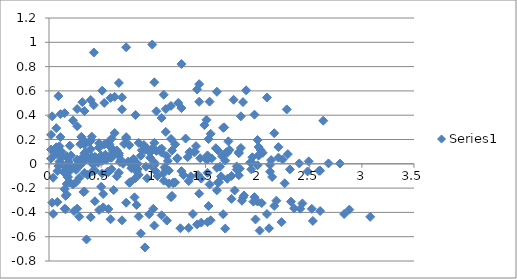
| Category | Series 0 |
|---|---|
| 1.9399999999999995 | -0.046 |
| 0.23000000000000043 | -0.169 |
| 0.1999999999999993 | -0.154 |
| 0.9700000000000006 | 0.05 |
| 0.370000000000001 | -0.092 |
| 0.17999999999999972 | -0.111 |
| 0.8499999999999996 | -0.044 |
| 1.9800000000000004 | -0.458 |
| 0.7099999999999991 | 0 |
| 1.3100000000000005 | 0.208 |
| 0.14000000000000057 | -0.067 |
| 0.8100000000000005 | 0.018 |
| 1.1500000000000004 | -0.056 |
| 0.5399999999999991 | 0.053 |
| 1.83 | -0.041 |
| 0.6500000000000004 | -0.103 |
| 0.20999999999999908 | 0.069 |
| 0.11999999999999922 | 0.05 |
| 1.75 | -0.1 |
| 1.67 | -0.415 |
| 1.3499999999999996 | 0.093 |
| 0.02999999999999936 | -0.32 |
| 1.6400000000000006 | -0.024 |
| 0.3000000000000007 | -0.01 |
| 2.2300000000000004 | -0.48 |
| 1.2400000000000002 | 0.501 |
| 1.709999999999999 | -0.124 |
| 2.139999999999999 | -0.109 |
| 0.9699999999999989 | 0.096 |
| 2.3100000000000005 | -0.046 |
| 2.119999999999999 | -0.065 |
| 2.789999999999999 | 0.002 |
| 0.040000000000000924 | -0.412 |
| 1.2300000000000004 | 0.046 |
| 0.629999999999999 | 0.254 |
| 1.799999999999999 | -0.022 |
| 1.129999999999999 | 0.064 |
| 0.7899999999999991 | -0.01 |
| 1.4000000000000004 | 0.098 |
| 0.10999999999999943 | 0.005 |
| 2.59 | -0.058 |
| 1.7300000000000004 | 0.115 |
| 1.8200000000000003 | 0.096 |
| 0.1899999999999995 | -0.055 |
| 0.2699999999999996 | -0.369 |
| 0.5899999999999999 | 0.139 |
| 1.9699999999999989 | -0.274 |
| 0.29999999999999893 | 0.022 |
| 2.24 | 0.035 |
| 0.2900000000000009 | -0.435 |
| 0.6999999999999993 | 0.547 |
| 0.4299999999999997 | 0.015 |
| 0.7400000000000002 | 0.22 |
| 0.6000000000000014 | 0.078 |
| 0.41000000000000014 | 0.058 |
| 1.08 | 0.125 |
| 1.75 | -0.289 |
| 0.47999999999999865 | 0.17 |
| 1.08 | 0.377 |
| 0.08999999999999986 | 0.102 |
| 0.5800000000000001 | 0.188 |
| 0.9199999999999999 | 0.113 |
| 0.3099999999999987 | 0.222 |
| 1.5999999999999996 | 0.128 |
| 0.8800000000000008 | 0.066 |
| 0.02000000000000135 | 0.238 |
| 0.11000000000000121 | 0.219 |
| 1.5199999999999996 | 0.069 |
| 1.4399999999999995 | -0.245 |
| 1.1199999999999992 | 0.262 |
| 0.2599999999999998 | -0.151 |
| 1.4100000000000001 | 0.145 |
| 0.5300000000000011 | 0.159 |
| 2.0 | -0.311 |
| 1.0099999999999998 | 0.671 |
| 1.17 | 0.204 |
| 0.1700000000000017 | 0.063 |
| 0.019999999999999574 | 0.043 |
| 0.6500000000000004 | 0.11 |
| 2.1799999999999997 | -0.304 |
| 0.9099999999999984 | 0.155 |
| 1.5099999999999998 | 0.362 |
| 0.33999999999999986 | 0.087 |
| 1.0099999999999998 | 0.173 |
| 1.3499999999999996 | 0.098 |
| 0.7399999999999984 | 0.207 |
| 2.0299999999999994 | 0.113 |
| 0.45000000000000107 | 0.051 |
| 0.40999999999999837 | 0.223 |
| 0.3199999999999985 | 0.204 |
| 1.9499999999999993 | 0.054 |
| 1.8699999999999992 | -0.26 |
| 1.549999999999999 | 0.247 |
| 0.16999999999999993 | -0.166 |
| 1.8399999999999999 | 0.13 |
| 0.10000000000000142 | 0.144 |
| 2.4299999999999997 | -0.326 |
| 1.4399999999999995 | 0.655 |
| 1.3400000000000016 | -0.142 |
| 1.1500000000000004 | -0.161 |
| 1.8200000000000003 | -0.094 |
| 1.0099999999999998 | -0.508 |
| 0.26000000000000156 | -0.05 |
| 0.33999999999999986 | 0.158 |
| 0.8300000000000001 | -0.117 |
| 0.16000000000000014 | -0.032 |
| 0.17999999999999972 | -0.106 |
| 0.4300000000000015 | 0.002 |
| 0.8599999999999994 | -0.091 |
| 1.620000000000001 | -0.154 |
| 0.7600000000000016 | 0.019 |
| 0.8500000000000014 | 0 |
| 0.7799999999999994 | -0.151 |
| 0.6999999999999993 | -0.465 |
| 0.379999999999999 | 0.043 |
| 1.0 | -0.37 |
| 0.6699999999999999 | -0.074 |
| 1.2700000000000014 | -0.061 |
| 1.2599999999999998 | -0.531 |
| 0.2699999999999996 | 0.451 |
| 0.19000000000000128 | -0.019 |
| 0.47999999999999865 | 0.048 |
| 2.3500000000000014 | -0.366 |
| 1.08 | 0.092 |
| 1.6800000000000015 | 0.3 |
| 0.5100000000000016 | 0.024 |
| 1.1800000000000015 | 0.11 |
| 1.5200000000000014 | 0.036 |
| 0.9100000000000001 | 0.144 |
| 2.200000000000001 | 0.051 |
| 0.27999999999999936 | -0.012 |
| 0.5800000000000001 | 0.161 |
| 0.4900000000000002 | 0.142 |
| 2.120000000000001 | -0.009 |
| 2.040000000000001 | -0.323 |
| 1.7200000000000006 | 0.185 |
| 0.34000000000000163 | -0.228 |
| 2.0100000000000016 | 0.068 |
| 0.07000000000000028 | 0.081 |
| 2.6000000000000014 | -0.389 |
| 1.6100000000000012 | 0.593 |
| 0.6699999999999999 | 0.067 |
| 2.16 | -0.347 |
| 0.8899999999999988 | 0.111 |
| 1.4900000000000002 | 0.319 |
| 0.3200000000000003 | 0.044 |
| 0.9900000000000002 | 0.129 |
| 1.33 | 0.055 |
| 0.7199999999999989 | 0.164 |
| 2.01 | 0.07 |
| 0.47000000000000064 | 0.008 |
| 0.3899999999999988 | 0.18 |
| 0.29999999999999893 | 0.161 |
| 1.9299999999999997 | 0.011 |
| 1.8499999999999996 | -0.304 |
| 1.5299999999999994 | 0.204 |
| 0.15000000000000036 | -0.209 |
| 1.8200000000000003 | 0.087 |
| 0.120000000000001 | 0.101 |
| 2.41 | -0.37 |
| 1.42 | 0.612 |
| 2.83 | -0.414 |
| 1.5599999999999987 | 0.044 |
| 2.16 | 0.252 |
| 0.9900000000000002 | -0.023 |
| 1.6600000000000001 | 0.062 |
| 2.0 | -0.012 |
| 1.3899999999999988 | 0.097 |
| 2.6799999999999997 | 0.003 |
| 0.1999999999999993 | -0.059 |
| 1.0599999999999987 | 0.113 |
| 0.9699999999999989 | 0.094 |
| 2.5999999999999996 | -0.056 |
| 2.5199999999999996 | -0.371 |
| 2.1999999999999993 | 0.137 |
| 0.8200000000000003 | -0.276 |
| 2.49 | 0.02 |
| 0.5499999999999989 | 0.034 |
| 3.08 | -0.436 |
| 2.09 | 0.545 |
| 1.2700000000000014 | 0.458 |
| 0.6699999999999999 | 0.666 |
| 1.8399999999999999 | 0.391 |
| 1.17 | 0.476 |
| 0.8300000000000001 | 0.402 |
| 1.4400000000000013 | 0.511 |
| 0.15000000000000036 | 0.417 |
| 2.630000000000001 | 0.355 |
| 1.7700000000000014 | 0.527 |
| 1.8600000000000012 | 0.508 |
| 0.23000000000000043 | 0.357 |
| 0.3100000000000005 | 0.043 |
| 0.6300000000000008 | 0.551 |
| 2.01 | 0.138 |
| 0.33999999999999986 | 0.434 |
| 2.280000000000001 | 0.448 |
| 0.25 | -0.023 |
| 0.7400000000000002 | 0.959 |
| 0.6000000000000014 | 0.208 |
| 0.5699999999999985 | -0.068 |
| 0.10000000000000142 | 0.018 |
| 0.4400000000000013 | -0.056 |
| 0.16999999999999993 | 0.052 |
| 1.120000000000001 | -0.041 |
| 1.3599999999999994 | -0.104 |
| 0.5 | 0.069 |
| 0.5899999999999999 | 0.05 |
| 1.040000000000001 | -0.101 |
| 0.9600000000000009 | -0.415 |
| 0.6400000000000006 | 0.093 |
| 0.7399999999999984 | -0.32 |
| 0.9300000000000015 | -0.024 |
| 1.0099999999999998 | -0.011 |
| 1.5200000000000014 | -0.481 |
| 0.5300000000000011 | 0.501 |
| 1.17 | -0.275 |
| 0.5 | -0.189 |
| 0.16000000000000014 | -0.264 |
| 0.7700000000000014 | -0.155 |
| 0.5199999999999996 | -0.249 |
| 1.9600000000000009 | -0.311 |
| 1.1000000000000014 | -0.139 |
| 1.1900000000000013 | -0.158 |
| 0.4399999999999995 | -0.308 |
| 0.35999999999999943 | -0.623 |
| 0.03999999999999915 | -0.115 |
| 1.3399999999999999 | -0.528 |
| 0.33000000000000007 | -0.232 |
| 1.6100000000000012 | -0.218 |
| 0.9199999999999999 | -0.688 |
| 0.07000000000000028 | 0.293 |
| 0.6699999999999999 | 0.086 |
| 1.0099999999999998 | 0.011 |
| 0.3999999999999986 | 0.12 |
| 1.6899999999999995 | 0.026 |
| 0.7900000000000009 | -0.036 |
| 0.06999999999999851 | 0.136 |
| 0.02000000000000135 | 0.117 |
| 1.6099999999999994 | -0.033 |
| 1.5299999999999994 | -0.347 |
| 1.209999999999999 | 0.16 |
| 0.16999999999999993 | -0.253 |
| 1.5 | 0.043 |
| 0.4400000000000013 | 0.057 |
| 2.09 | -0.413 |
| 1.0999999999999996 | 0.569 |
| 0.33999999999999986 | -0.074 |
| 0.27000000000000135 | 0.034 |
| 1.0199999999999996 | -0.059 |
| 1.4600000000000009 | -0.122 |
| 0.6000000000000014 | 0.051 |
| 0.6900000000000013 | 0.032 |
| 0.9399999999999995 | -0.119 |
| 0.8599999999999994 | -0.433 |
| 0.5399999999999991 | 0.075 |
| 0.8399999999999999 | -0.338 |
| 0.8300000000000001 | -0.042 |
| 1.1100000000000012 | -0.029 |
| 1.42 | -0.499 |
| 0.4299999999999997 | 0.483 |
| 0.6100000000000012 | 0.109 |
| 0.6799999999999997 | 0.015 |
| 1.8000000000000007 | -0.047 |
| 0.9400000000000013 | 0.125 |
| 1.0300000000000011 | 0.106 |
| 0.5999999999999996 | -0.044 |
| 0.5199999999999996 | -0.359 |
| 0.1999999999999993 | 0.149 |
| 1.1799999999999997 | -0.264 |
| 0.4900000000000002 | 0.032 |
| 1.450000000000001 | 0.046 |
| 1.08 | -0.424 |
| 0.08999999999999986 | 0.557 |
| 1.290000000000001 | -0.094 |
| 1.1899999999999995 | -0.156 |
| 0.33000000000000007 | 0.017 |
| 0.41999999999999993 | -0.003 |
| 1.2100000000000009 | -0.153 |
| 1.1300000000000008 | -0.467 |
| 0.8100000000000005 | 0.04 |
| 0.5699999999999985 | -0.373 |
| 1.1000000000000014 | -0.077 |
| 0.8399999999999999 | -0.063 |
| 1.6900000000000013 | -0.533 |
| 0.7000000000000011 | 0.449 |
| 2.4800000000000004 | -0.062 |
| 1.620000000000001 | 0.11 |
| 1.7100000000000009 | 0.091 |
| 0.08000000000000007 | -0.06 |
| 0.16000000000000014 | -0.374 |
| 0.4800000000000004 | 0.134 |
| 1.8599999999999994 | -0.279 |
| 0.1899999999999995 | 0.017 |
| 2.130000000000001 | 0.031 |
| 0.40000000000000036 | -0.44 |
| 0.5899999999999999 | 0.542 |
| 0.8599999999999994 | 0.173 |
| 0.7699999999999996 | 0.154 |
| 2.4000000000000004 | 0.003 |
| 2.3200000000000003 | -0.311 |
| 2.0 | 0.196 |
| 0.620000000000001 | -0.217 |
| 2.290000000000001 | 0.079 |
| 0.34999999999999964 | 0.093 |
| 2.880000000000001 | -0.377 |
| 1.8900000000000006 | 0.605 |
| 0.08999999999999986 | -0.019 |
| 1.540000000000001 | -0.17 |
| 1.4600000000000009 | -0.484 |
| 1.1400000000000006 | 0.024 |
| 0.23999999999999844 | -0.389 |
| 1.4300000000000015 | -0.093 |
| 0.5099999999999998 | -0.08 |
| 2.0200000000000014 | -0.55 |
| 1.0300000000000011 | 0.432 |
| 1.6300000000000008 | -0.151 |
| 1.5500000000000007 | -0.465 |
| 1.2300000000000004 | 0.043 |
| 0.14999999999999858 | -0.37 |
| 1.5200000000000014 | -0.074 |
| 0.41999999999999993 | -0.06 |
| 2.110000000000001 | -0.531 |
| 1.120000000000001 | 0.451 |
| 0.08000000000000007 | -0.314 |
| 0.40000000000000036 | 0.193 |
| 1.7799999999999994 | -0.22 |
| 0.10999999999999943 | 0.077 |
| 2.0500000000000007 | 0.09 |
| 0.4800000000000004 | -0.38 |
| 0.5099999999999998 | 0.602 |
| 0.3200000000000003 | 0.508 |
| 1.6999999999999993 | 0.095 |
| 0.02999999999999936 | 0.391 |
| 1.9700000000000006 | 0.404 |
| 0.5600000000000005 | -0.066 |
| 0.4299999999999997 | 0.916 |
| 1.379999999999999 | -0.413 |
| 0.2900000000000009 | -0.117 |
| 1.6500000000000004 | -0.103 |
| 0.8800000000000008 | -0.573 |
| 0.10999999999999943 | 0.408 |
| 1.67 | 0.296 |
| 0.27000000000000135 | 0.31 |
| 2.26 | -0.16 |
| 1.2699999999999996 | 0.821 |
| 1.9400000000000013 | 0.014 |
| 0.5899999999999999 | -0.457 |
| 0.40000000000000036 | 0.525 |
| 2.530000000000001 | -0.47 |
| 1.540000000000001 | 0.512 |
| 0.9900000000000002 | 0.982 |